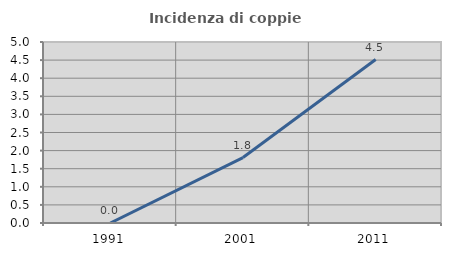
| Category | Incidenza di coppie miste |
|---|---|
| 1991.0 | 0 |
| 2001.0 | 1.807 |
| 2011.0 | 4.516 |